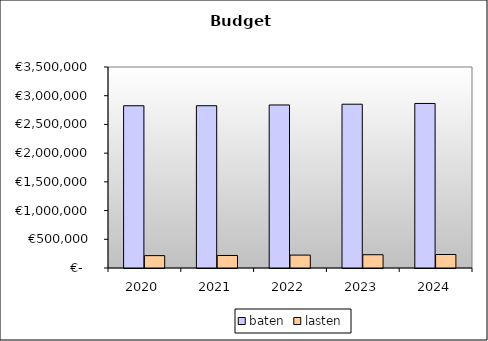
| Category | baten | lasten |
|---|---|---|
| 2020.0 | 2825487.637 | 215392.017 |
| 2021.0 | 2825790.888 | 218099.2 |
| 2022.0 | 2838872.657 | 224529.6 |
| 2023.0 | 2851954.427 | 231070.4 |
| 2024.0 | 2865036.198 | 234912 |